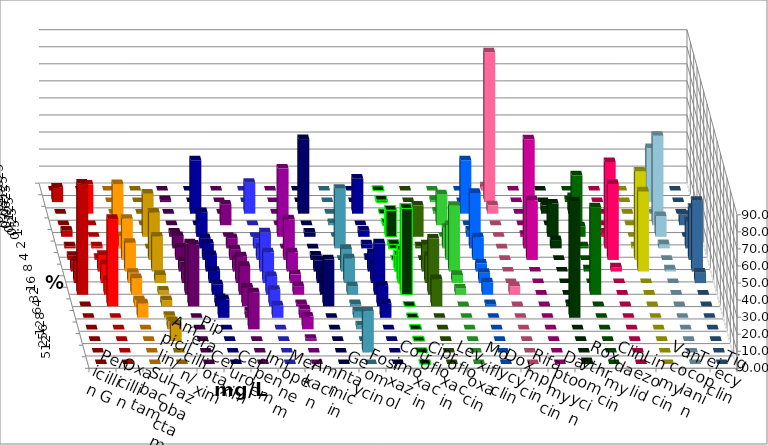
| Category | Penicillin G | Oxacillin | Ampicillin/ Sulbactam | Piperacillin/ Tazobactam | Cefotaxim | Cefuroxim | Imipenem | Meropenem | Amikacin | Gentamicin | Fosfomycin | Cotrimoxazol | Ciprofloxacin | Levofloxacin | Moxifloxacin | Doxycyclin | Rifampicin | Daptomycin | Roxythromycin | Clindamycin | Linezolid | Vancomycin | Teicoplanin | Tigecyclin |
|---|---|---|---|---|---|---|---|---|---|---|---|---|---|---|---|---|---|---|---|---|---|---|---|---|
| 0.015625 | 0 | 0 | 0 | 0 | 0 | 0 | 0 | 0 | 0 | 0 | 0 | 0 | 0 | 0 | 0 | 0 | 2.439 | 0 | 0 | 0 | 0 | 0 | 0 | 0 |
| 0.03125 | 8.434 | 0 | 0 | 0 | 1.205 | 0 | 0 | 0 | 0 | 0 | 0 | 0 | 1.205 | 0 | 1.205 | 0 | 87.805 | 0 | 0 | 1.22 | 0 | 0 | 0 | 31.707 |
| 0.0625 | 0 | 17.073 | 0 | 0 | 0 | 0 | 31.325 | 18.072 | 0 | 43.75 | 0 | 20.482 | 0 | 0 | 1.205 | 31.325 | 4.878 | 0 | 4.878 | 9.756 | 0 | 0 | 0 | 0 |
| 0.125 | 0 | 0 | 24.096 | 0 | 0 | 12.048 | 0 | 0 | 0 | 0 | 1.205 | 0 | 1.205 | 0 | 18.072 | 0 | 0 | 0 | 0 | 29.268 | 0 | 0 | 6.098 | 52.439 |
| 0.25 | 3.614 | 0 | 0 | 25.301 | 2.41 | 0 | 14.458 | 0 | 40 | 2.5 | 0 | 3.614 | 15.663 | 18.293 | 0 | 3.614 | 0 | 1.205 | 19.512 | 6.098 | 2.41 | 0 | 0 | 12.195 |
| 0.5 | 1.205 | 1.22 | 7.229 | 0 | 7.229 | 6.024 | 6.024 | 6.024 | 0 | 0 | 34.94 | 2.41 | 2.41 | 1.22 | 12.048 | 32.53 | 0 | 63.855 | 4.878 | 1.22 | 50.602 | 1.205 | 15.854 | 2.439 |
| 1.0 | 2.41 | 1.22 | 24.096 | 27.711 | 7.229 | 6.024 | 9.639 | 7.229 | 23.75 | 2.5 | 0 | 1.205 | 0 | 0 | 20.482 | 13.253 | 0 | 34.94 | 0 | 0 | 44.578 | 51.807 | 30.488 | 0 |
| 2.0 | 6.024 | 9.756 | 16.867 | 20.482 | 6.024 | 7.229 | 9.639 | 22.892 | 11.25 | 6.25 | 13.253 | 10.843 | 9.639 | 15.854 | 38.554 | 4.819 | 0 | 0 | 0 | 1.22 | 2.41 | 46.988 | 41.463 | 1.22 |
| 4.0 | 13.253 | 10.976 | 6.024 | 4.819 | 9.639 | 15.663 | 7.229 | 18.072 | 5 | 7.5 | 14.458 | 10.843 | 19.277 | 15.854 | 4.819 | 6.024 | 0 | 0 | 0 | 0 | 0 | 0 | 6.098 | 0 |
| 8.0 | 65.06 | 8.537 | 9.639 | 2.41 | 30.12 | 16.867 | 6.024 | 10.843 | 5 | 10 | 4.819 | 30.12 | 50.602 | 32.927 | 3.614 | 7.229 | 4.878 | 0 | 0 | 51.22 | 0 | 0 | 0 | 0 |
| 16.0 | 0 | 51.22 | 3.614 | 3.614 | 36.145 | 10.843 | 4.819 | 9.639 | 1.25 | 27.5 | 1.205 | 12.048 | 0 | 15.854 | 0 | 1.205 | 0 | 0 | 1.22 | 0 | 0 | 0 | 0 | 0 |
| 32.0 | 0 | 0 | 8.434 | 1.205 | 0 | 3.614 | 10.843 | 7.229 | 5 | 0 | 3.614 | 8.434 | 0 | 0 | 0 | 0 | 0 | 0 | 68.293 | 0 | 0 | 0 | 0 | 0 |
| 64.0 | 0 | 0 | 0 | 4.819 | 0 | 21.687 | 0 | 0 | 7.5 | 0 | 2.41 | 0 | 0 | 0 | 0 | 0 | 0 | 0 | 0 | 0 | 0 | 0 | 0 | 0 |
| 128.0 | 0 | 0 | 0 | 9.639 | 0 | 0 | 0 | 0 | 1.25 | 0 | 0 | 0 | 0 | 0 | 0 | 0 | 0 | 0 | 0 | 0 | 0 | 0 | 0 | 0 |
| 256.0 | 0 | 0 | 0 | 0 | 0 | 0 | 0 | 0 | 0 | 0 | 24.096 | 0 | 0 | 0 | 0 | 0 | 0 | 0 | 0 | 0 | 0 | 0 | 0 | 0 |
| 512.0 | 0 | 0 | 0 | 0 | 0 | 0 | 0 | 0 | 0 | 0 | 0 | 0 | 0 | 0 | 0 | 0 | 0 | 0 | 1.22 | 0 | 0 | 0 | 0 | 0 |